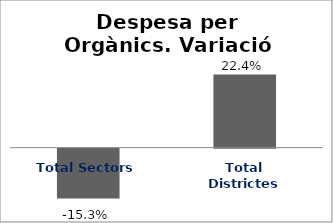
| Category | Series 0 |
|---|---|
| Total Sectors | -0.153 |
| Total Districtes | 0.224 |